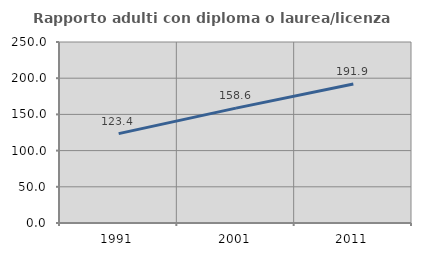
| Category | Rapporto adulti con diploma o laurea/licenza media  |
|---|---|
| 1991.0 | 123.401 |
| 2001.0 | 158.649 |
| 2011.0 | 191.862 |